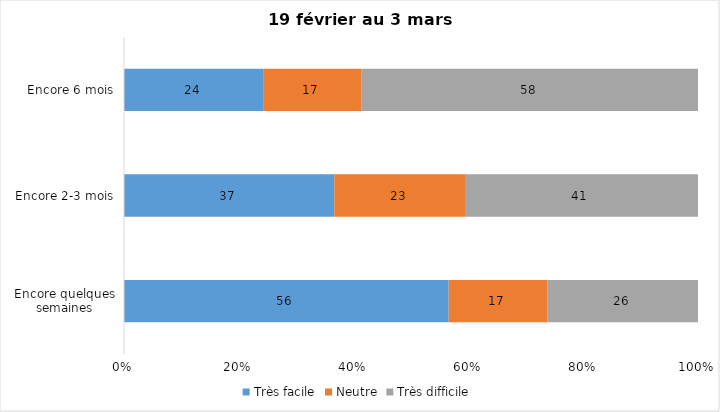
| Category | Très facile | Neutre | Très difficile |
|---|---|---|---|
| Encore quelques semaines | 56 | 17 | 26 |
| Encore 2-3 mois | 37 | 23 | 41 |
| Encore 6 mois | 24 | 17 | 58 |